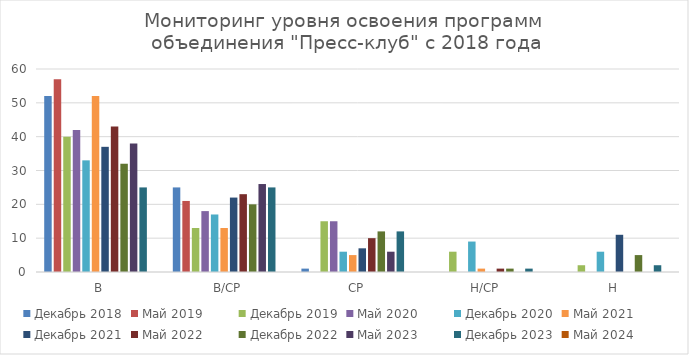
| Category | Декабрь 2018 | Май 2019 | Декабрь 2019 | Май 2020 | Декабрь 2020 | Май 2021 | Декабрь 2021 | Май 2022 | Декабрь 2022 | Май 2023 | Декабрь 2023 | Май 2024 |
|---|---|---|---|---|---|---|---|---|---|---|---|---|
| В | 52 | 57 | 40 | 42 | 33 | 52 | 37 | 43 | 32 | 38 | 25 | 0 |
| В/СР | 25 | 21 | 13 | 18 | 17 | 13 | 22 | 23 | 20 | 26 | 25 | 0 |
| СР | 1 | 0 | 15 | 15 | 6 | 5 | 7 | 10 | 12 | 6 | 12 | 0 |
| Н/СР | 0 | 0 | 6 | 0 | 9 | 1 | 0 | 1 | 1 | 0 | 1 | 0 |
| Н | 0 | 0 | 2 | 0 | 6 | 0 | 11 | 0 | 5 | 0 | 2 | 0 |